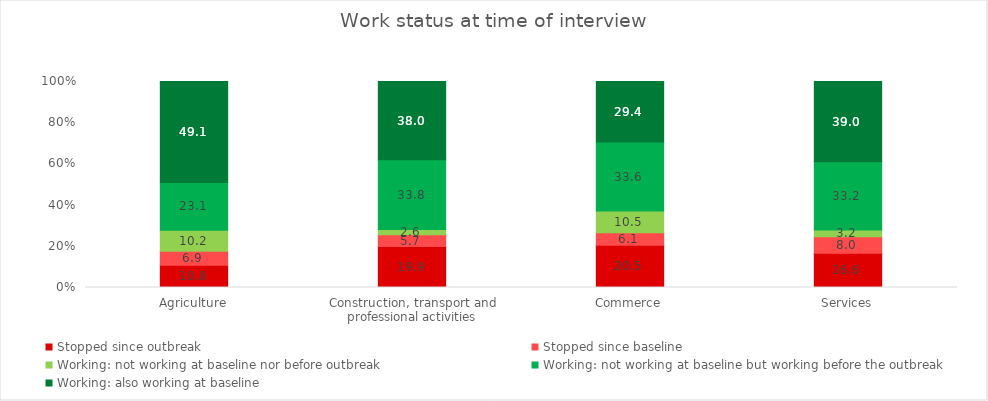
| Category | Stopped since outbreak | Stopped since baseline | Working: not working at baseline nor before outbreak | Working: not working at baseline but working before the outbreak | Working: also working at baseline |
|---|---|---|---|---|---|
| Agriculture | 10.769 | 6.851 | 10.204 | 23.116 | 49.06 |
| Construction, transport and professional activities | 19.916 | 5.682 | 2.605 | 33.752 | 38.044 |
| Commerce | 20.451 | 6.096 | 10.543 | 33.551 | 29.359 |
| Services | 16.641 | 7.983 | 3.239 | 33.179 | 38.958 |